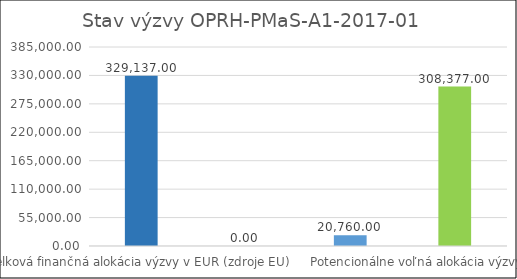
| Category | Stav výzvy OPRH-PMaS-A1-2017-01  |
|---|---|
| Celková finančná alokácia výzvy v EUR (zdroje EU) | 329137 |
| Suma žiadostí o NFP v konaní v EUR (zdroje EU) | 0 |
| Suma schválených žiadostí o NFP (zdroje EU) | 20760 |
| Potencionálne voľná alokácia výzvy (zdroje EU) | 308377 |